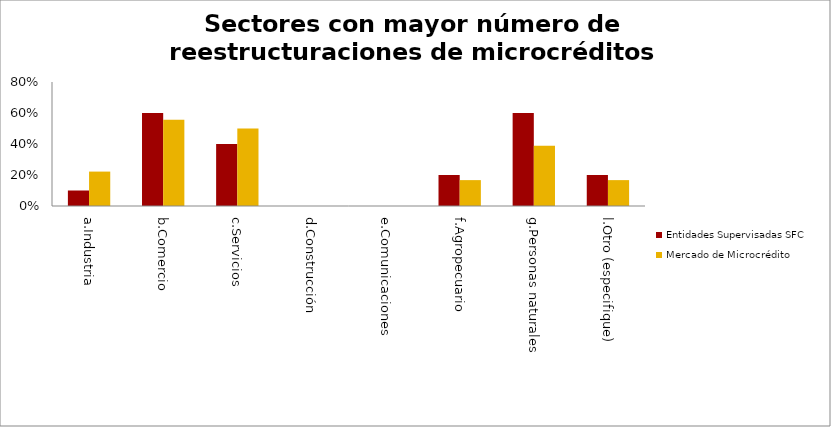
| Category | Entidades Supervisadas SFC | Mercado de Microcrédito |
|---|---|---|
| a.Industria | 0.1 | 0.222 |
| b.Comercio | 0.6 | 0.556 |
| c.Servicios | 0.4 | 0.5 |
| d.Construcción | 0 | 0 |
| e.Comunicaciones | 0 | 0 |
| f.Agropecuario | 0.2 | 0.167 |
| g.Personas naturales | 0.6 | 0.389 |
| l.Otro (especifique) | 0.2 | 0.167 |